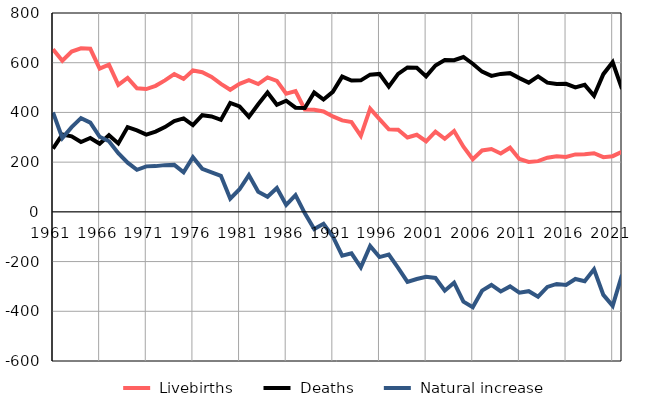
| Category |  Livebirths |  Deaths |  Natural increase |
|---|---|---|---|
| 1961.0 | 654 | 254 | 400 |
| 1962.0 | 608 | 311 | 297 |
| 1963.0 | 645 | 304 | 341 |
| 1964.0 | 658 | 281 | 377 |
| 1965.0 | 656 | 297 | 359 |
| 1966.0 | 576 | 274 | 302 |
| 1967.0 | 592 | 308 | 284 |
| 1968.0 | 511 | 275 | 236 |
| 1969.0 | 539 | 341 | 198 |
| 1970.0 | 497 | 328 | 169 |
| 1971.0 | 494 | 311 | 183 |
| 1972.0 | 507 | 323 | 184 |
| 1973.0 | 529 | 341 | 188 |
| 1974.0 | 554 | 365 | 189 |
| 1975.0 | 535 | 376 | 159 |
| 1976.0 | 569 | 349 | 220 |
| 1977.0 | 562 | 389 | 173 |
| 1978.0 | 543 | 384 | 159 |
| 1979.0 | 515 | 370 | 145 |
| 1980.0 | 491 | 438 | 53 |
| 1981.0 | 515 | 424 | 91 |
| 1982.0 | 530 | 382 | 148 |
| 1983.0 | 514 | 433 | 81 |
| 1984.0 | 541 | 480 | 61 |
| 1985.0 | 527 | 431 | 96 |
| 1986.0 | 475 | 447 | 28 |
| 1987.0 | 486 | 419 | 67 |
| 1988.0 | 412 | 418 | -6 |
| 1989.0 | 411 | 480 | -69 |
| 1990.0 | 404 | 452 | -48 |
| 1991.0 | 384 | 483 | -99 |
| 1992.0 | 368 | 544 | -176 |
| 1993.0 | 361 | 528 | -167 |
| 1994.0 | 306 | 529 | -223 |
| 1995.0 | 415 | 552 | -137 |
| 1996.0 | 373 | 555 | -182 |
| 1997.0 | 332 | 504 | -172 |
| 1998.0 | 330 | 555 | -225 |
| 1999.0 | 299 | 581 | -282 |
| 2000.0 | 310 | 580 | -270 |
| 2001.0 | 284 | 545 | -261 |
| 2002.0 | 323 | 589 | -266 |
| 2003.0 | 294 | 611 | -317 |
| 2004.0 | 325 | 610 | -285 |
| 2005.0 | 262 | 623 | -361 |
| 2006.0 | 212 | 596 | -384 |
| 2007.0 | 247 | 564 | -317 |
| 2008.0 | 253 | 547 | -294 |
| 2009.0 | 235 | 555 | -320 |
| 2010.0 | 258 | 558 | -300 |
| 2011.0 | 213 | 538 | -325 |
| 2012.0 | 201 | 520 | -319 |
| 2013.0 | 204 | 545 | -341 |
| 2014.0 | 218 | 520 | -302 |
| 2015.0 | 224 | 514 | -290 |
| 2016.0 | 221 | 515 | -294 |
| 2017.0 | 231 | 501 | -270 |
| 2018.0 | 232 | 511 | -279 |
| 2019.0 | 236 | 467 | -231 |
| 2020.0 | 220 | 554 | -334 |
| 2021.0 | 224 | 602 | -378 |
| 2022.0 | 242 | 495 | -253 |